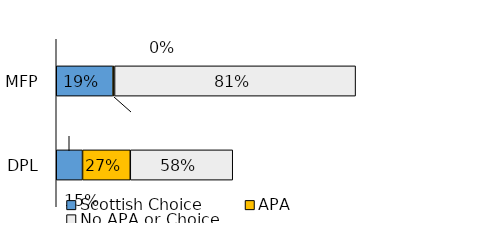
| Category | Scottish Choice | APA | No APA or Choice |
|---|---|---|---|
| 0 | 77047 | 1955 | 326593 |
| 1 | 35596 | 64727 | 138805 |